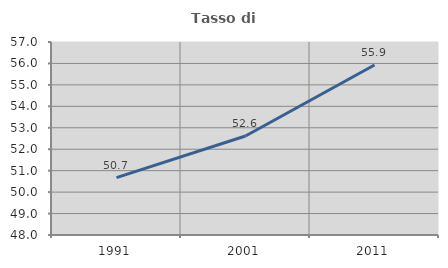
| Category | Tasso di occupazione   |
|---|---|
| 1991.0 | 50.673 |
| 2001.0 | 52.615 |
| 2011.0 | 55.926 |